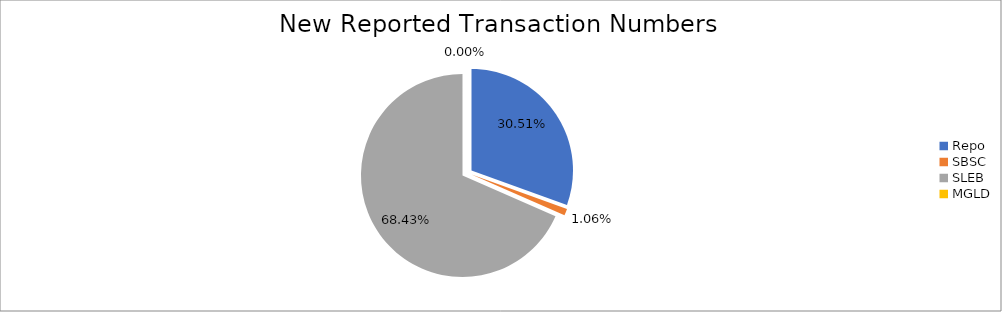
| Category | Series 0 |
|---|---|
| Repo | 292340 |
| SBSC | 10110 |
| SLEB | 655763 |
| MGLD | 25 |